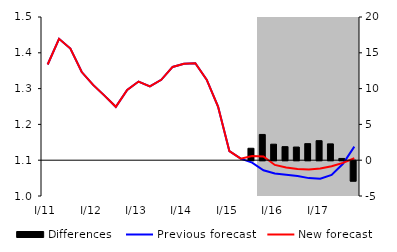
| Category | Differences |
|---|---|
| 0 | 0 |
| 1 | 0 |
| 2 | 0 |
| 3 | 0 |
| 4 | 0 |
| 5 | 0 |
| 6 | 0 |
| 7 | 0 |
| 8 | 0 |
| 9 | 0 |
| 10 | 0 |
| 11 | 0 |
| 12 | 0 |
| 13 | 0 |
| 14 | 0 |
| 15 | 0 |
| 16 | 0 |
| 17 | 0 |
| 18 | 1.668 |
| 19 | 3.596 |
| 20 | 2.236 |
| 21 | 1.894 |
| 22 | 1.838 |
| 23 | 2.311 |
| 24 | 2.728 |
| 25 | 2.281 |
| 26 | 0.245 |
| 27 | -2.85 |